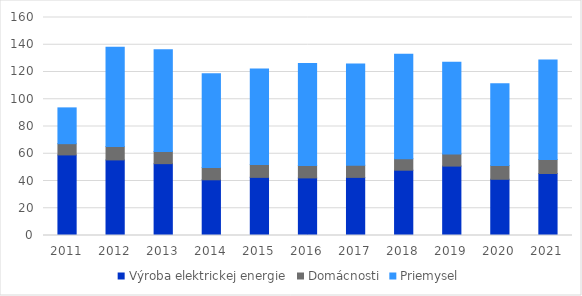
| Category | Výroba elektrickej energie | Domácnosti | Priemysel |
|---|---|---|---|
| 2011.0 | 59.145 | 8.255 | 26.266 |
| 2012.0 | 55.474 | 9.775 | 72.94 |
| 2013.0 | 52.731 | 8.951 | 74.701 |
| 2014.0 | 40.881 | 8.991 | 68.849 |
| 2015.0 | 42.669 | 9.404 | 70.136 |
| 2016.0 | 42.274 | 9.028 | 75.012 |
| 2017.0 | 42.653 | 8.901 | 74.282 |
| 2018.0 | 47.917 | 8.462 | 76.628 |
| 2019.0 | 50.939 | 8.933 | 67.281 |
| 2020.0 | 41.263 | 10.042 | 60.105 |
| 2021.0 | 45.515 | 10.239 | 73.014 |